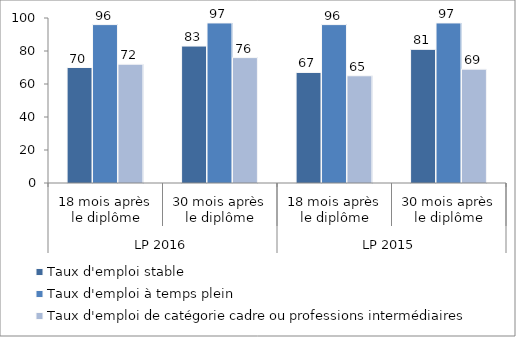
| Category | Taux d'emploi stable | Taux d'emploi à temps plein | Taux d'emploi de catégorie cadre ou professions intermédiaires |
|---|---|---|---|
| 0 | 70 | 96 | 72 |
| 1 | 83 | 97 | 76 |
| 2 | 67 | 96 | 65 |
| 3 | 81 | 97 | 69 |